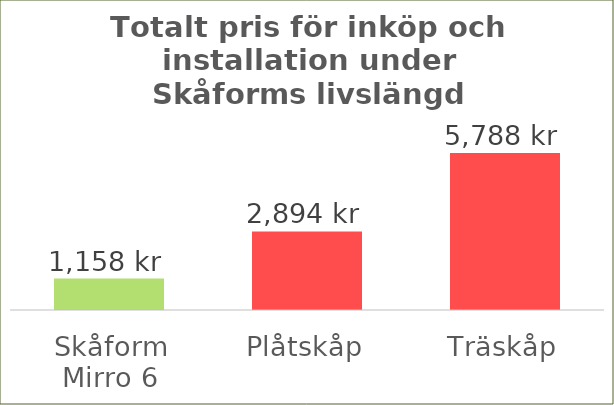
| Category | Totalt pris för inköp och installation under Skåforms livslängd |
|---|---|
| Skåform Mirro 6 | 1157.5 |
| Plåtskåp | 2893.75 |
| Träskåp | 5787.5 |